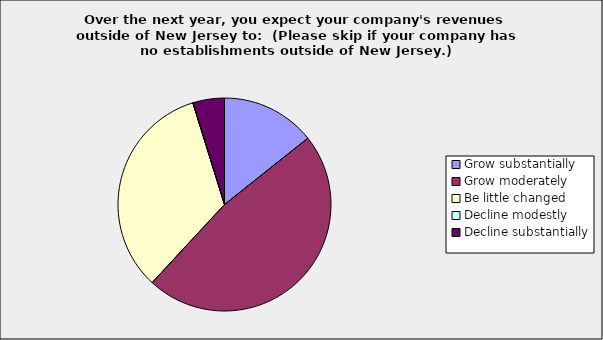
| Category | Series 0 |
|---|---|
| Grow substantially | 0.143 |
| Grow moderately | 0.476 |
| Be little changed | 0.333 |
| Decline modestly | 0 |
| Decline substantially | 0.048 |